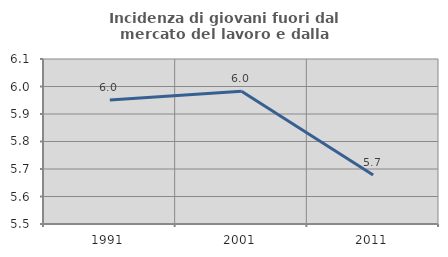
| Category | Incidenza di giovani fuori dal mercato del lavoro e dalla formazione  |
|---|---|
| 1991.0 | 5.951 |
| 2001.0 | 5.983 |
| 2011.0 | 5.678 |